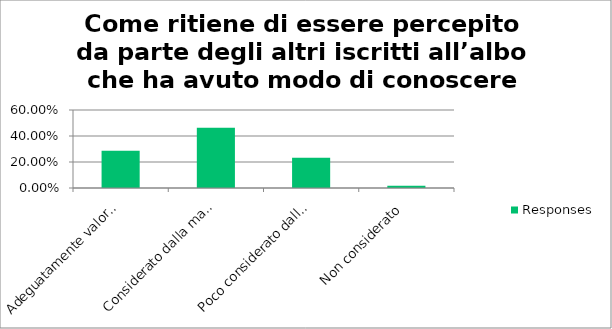
| Category | Responses |
|---|---|
| Adeguatamente valorizzato | 0.286 |
| Considerato dalla maggior parte dei colleghi | 0.464 |
| Poco considerato dalla maggior parte dei colleghi | 0.232 |
| Non considerato | 0.018 |